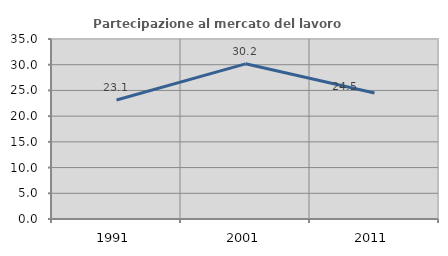
| Category | Partecipazione al mercato del lavoro  femminile |
|---|---|
| 1991.0 | 23.128 |
| 2001.0 | 30.171 |
| 2011.0 | 24.498 |